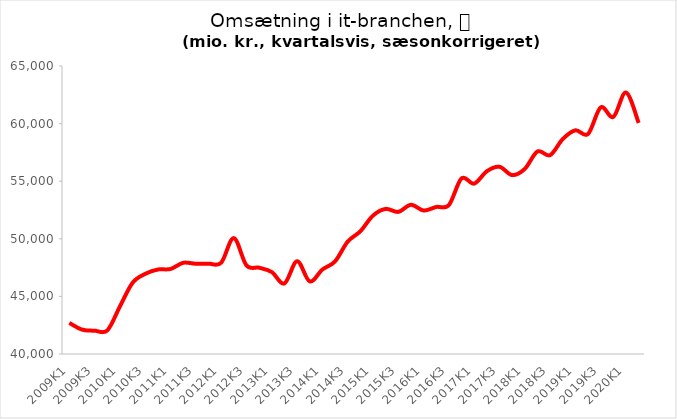
| Category | Series 0 |
|---|---|
| 2009K1 | 42695.959 |
| 2009K2 | 42118.491 |
| 2009K3 | 42024.536 |
| 2009K4 | 42045.181 |
| 2010K1 | 44129.951 |
| 2010K2 | 46181.352 |
| 2010K3 | 46956.927 |
| 2010K4 | 47334.413 |
| 2011K1 | 47379.841 |
| 2011K2 | 47917.207 |
| 2011K3 | 47833.116 |
| 2011K4 | 47842.331 |
| 2012K1 | 47921.979 |
| 2012K2 | 50060.39 |
| 2012K3 | 47692.303 |
| 2012K4 | 47488.482 |
| 2013K1 | 47115.32 |
| 2013K2 | 46123.305 |
| 2013K3 | 48052.483 |
| 2013K4 | 46304.731 |
| 2014K1 | 47330.176 |
| 2014K2 | 48038.065 |
| 2014K3 | 49753.356 |
| 2014K4 | 50650.816 |
| 2015K1 | 52011.952 |
| 2015K2 | 52596.038 |
| 2015K3 | 52337.146 |
| 2015K4 | 52952.013 |
| 2016K1 | 52455.031 |
| 2016K2 | 52763.44 |
| 2016K3 | 52931.269 |
| 2016K4 | 55241.016 |
| 2017K1 | 54790.681 |
| 2017K2 | 55864.948 |
| 2017K3 | 56251.233 |
| 2017K4 | 55529.414 |
| 2018K1 | 56069.316 |
| 2018K2 | 57581.166 |
| 2018K3 | 57260.264 |
| 2018K4 | 58660.086 |
| 2019K1 | 59417.056 |
| 2019K2 | 59100.695 |
| 2019K3 | 61406.812 |
| 2019K4 | 60581.576 |
| 2020K1 | 62698.087 |
| 2020K2 | 60057.865 |